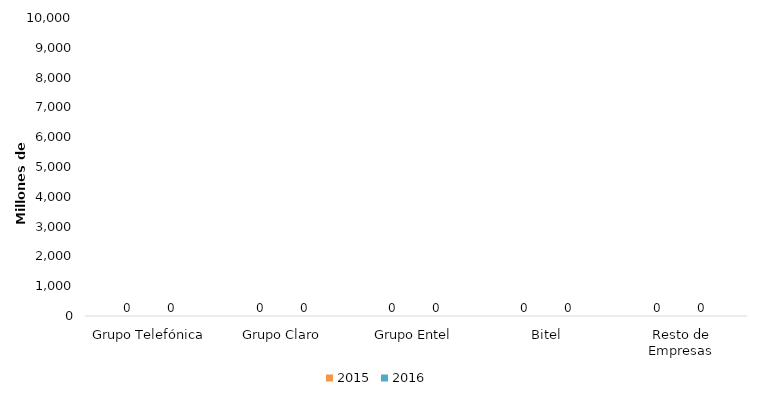
| Category | 2015 | 2016 |
|---|---|---|
| Grupo Telefónica | 0 | 0 |
| Grupo Claro | 0 | 0 |
| Grupo Entel | 0 | 0 |
| Bitel | 0 | 0 |
| Resto de Empresas | 0 | 0 |